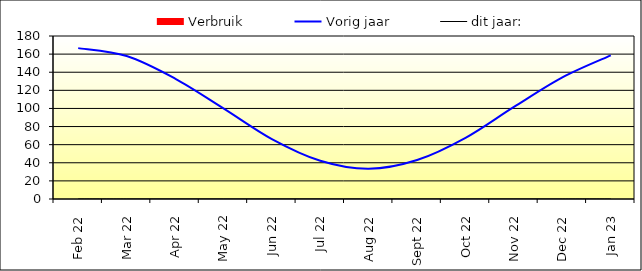
| Category | Verbruik |
|---|---|
| 2022-02-01 | 0 |
| 2022-03-01 | 0 |
| 2022-04-01 | 0 |
| 2022-05-01 | 0 |
| 2022-06-01 | 0 |
| 2022-07-01 | 0 |
| 2022-08-01 | 0 |
| 2022-09-01 | 0 |
| 2022-10-01 | 0 |
| 2022-11-01 | 0 |
| 2022-12-01 | 0 |
| 2023-01-01 | 0 |